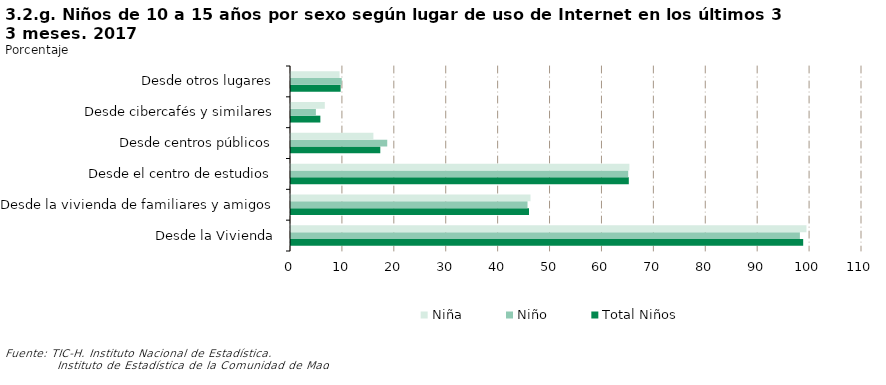
| Category | Total Niños | Niño | Niña |
|---|---|---|---|
| Desde la Vivienda | 98.67 | 98.036 | 99.302 |
| Desde la vivienda de familiares y amigos | 45.849 | 45.563 | 46.134 |
| Desde el centro de estudios | 65.076 | 64.964 | 65.188 |
| Desde centros públicos | 17.201 | 18.539 | 15.87 |
| Desde cibercafés y similares | 5.656 | 4.795 | 6.512 |
| Desde otros lugares | 9.563 | 9.773 | 9.354 |